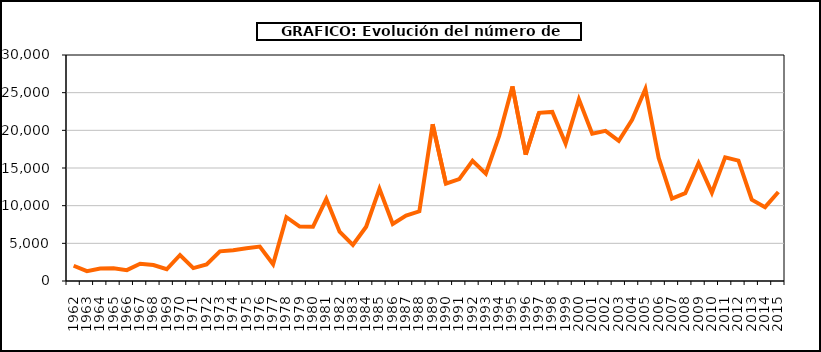
| Category | Series 0 |
|---|---|
| 1962.0 | 2022 |
| 1963.0 | 1302 |
| 1964.0 | 1645 |
| 1965.0 | 1686 |
| 1966.0 | 1443 |
| 1967.0 | 2299 |
| 1968.0 | 2115 |
| 1969.0 | 1558 |
| 1970.0 | 3450 |
| 1971.0 | 1718 |
| 1972.0 | 2194 |
| 1973.0 | 3932 |
| 1974.0 | 4088 |
| 1975.0 | 4340 |
| 1976.0 | 4577 |
| 1977.0 | 2221 |
| 1978.0 | 8471 |
| 1979.0 | 7222 |
| 1980.0 | 7190 |
| 1981.0 | 10878 |
| 1982.0 | 6545 |
| 1983.0 | 4791 |
| 1984.0 | 7203 |
| 1985.0 | 12238 |
| 1986.0 | 7570 |
| 1987.0 | 8679 |
| 1988.0 | 9247 |
| 1989.0 | 20811 |
| 1990.0 | 12913 |
| 1991.0 | 13531 |
| 1992.0 | 15955 |
| 1993.0 | 14254 |
| 1994.0 | 19263 |
| 1995.0 | 25827 |
| 1996.0 | 16771 |
| 1997.0 | 22320 |
| 1998.0 | 22446 |
| 1999.0 | 18237 |
| 2000.0 | 24118 |
| 2001.0 | 19547 |
| 2002.0 | 19929 |
| 2003.0 | 18616 |
| 2004.0 | 21396 |
| 2005.0 | 25492 |
| 2006.0 | 16334 |
| 2007.0 | 10932 |
| 2008.0 | 11656 |
| 2009.0 | 15642 |
| 2010.0 | 11722 |
| 2011.0 | 16414 |
| 2012.0 | 15978 |
| 2013.0 | 10797 |
| 2014.0 | 9806 |
| 2015.0 | 11810 |